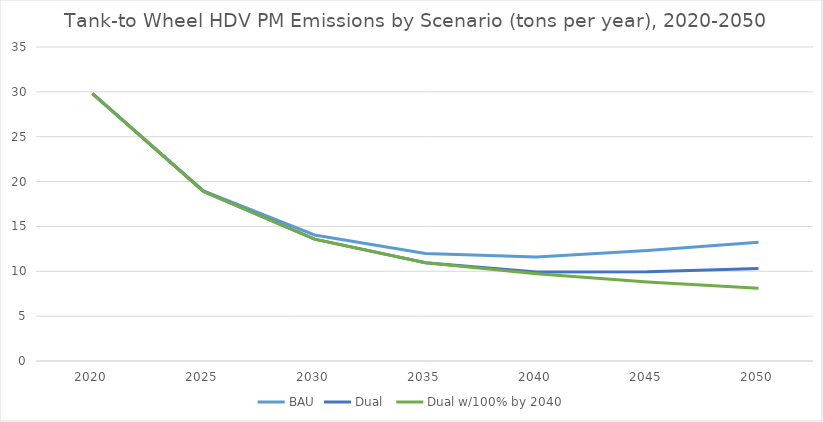
| Category | BAU | Dual  | Dual w/100% by 2040 |
|---|---|---|---|
| 2020.0 | 29.808 | 29.808 | 29.808 |
| 2025.0 | 18.968 | 18.903 | 18.903 |
| 2030.0 | 14.049 | 13.58 | 13.58 |
| 2035.0 | 11.994 | 10.945 | 10.945 |
| 2040.0 | 11.581 | 9.926 | 9.736 |
| 2045.0 | 12.31 | 9.958 | 8.799 |
| 2050.0 | 13.249 | 10.298 | 8.101 |